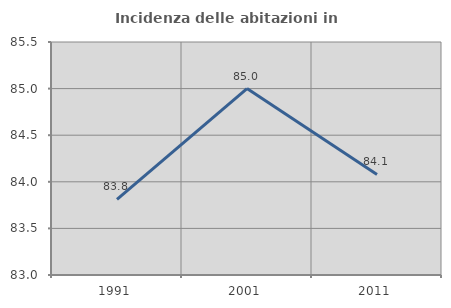
| Category | Incidenza delle abitazioni in proprietà  |
|---|---|
| 1991.0 | 83.811 |
| 2001.0 | 85 |
| 2011.0 | 84.079 |